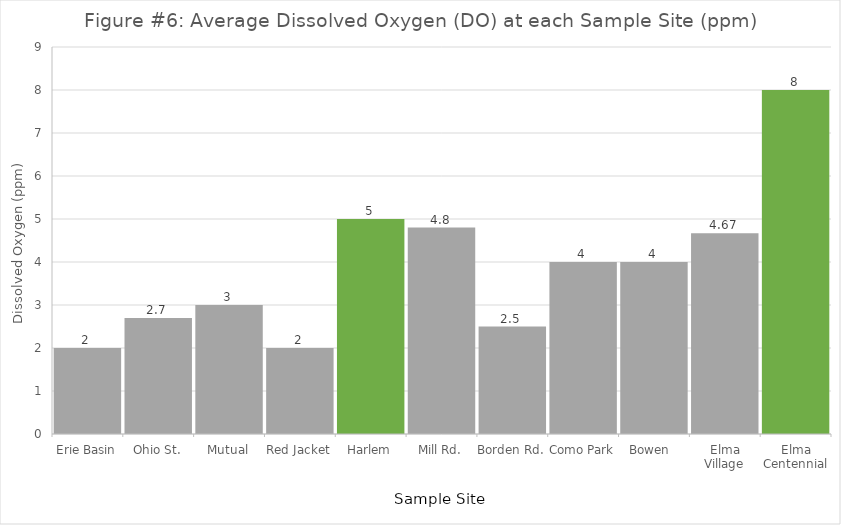
| Category | Series 0 |
|---|---|
| Erie Basin | 2 |
| Ohio St. | 2.7 |
| Mutual | 3 |
| Red Jacket | 2 |
| Harlem | 5 |
| Mill Rd. | 4.8 |
| Borden Rd. | 2.5 |
| Como Park | 4 |
| Bowen  | 4 |
| Elma Village | 4.67 |
| Elma Centennial | 8 |